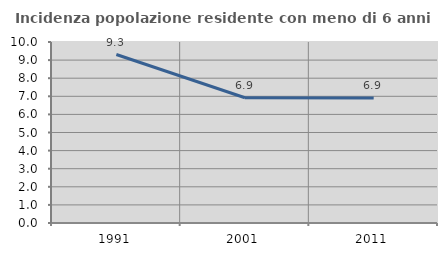
| Category | Incidenza popolazione residente con meno di 6 anni |
|---|---|
| 1991.0 | 9.307 |
| 2001.0 | 6.92 |
| 2011.0 | 6.909 |